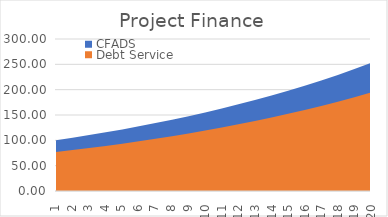
| Category | CFADS | Debt Service |
|---|---|---|
| 1.0 | 100 | 76.923 |
| 2.0 | 105.021 | 80.769 |
| 3.0 | 110.28 | 84.808 |
| 4.0 | 115.799 | 89.048 |
| 5.0 | 121.579 | 93.5 |
| 6.0 | 127.651 | 98.176 |
| 7.0 | 134.039 | 103.084 |
| 8.0 | 140.709 | 108.238 |
| 9.0 | 147.735 | 113.65 |
| 10.0 | 155.102 | 119.333 |
| 11.0 | 162.834 | 125.3 |
| 12.0 | 170.995 | 131.565 |
| 13.0 | 179.544 | 138.143 |
| 14.0 | 188.542 | 145.05 |
| 15.0 | 197.991 | 152.302 |
| 16.0 | 207.897 | 159.918 |
| 17.0 | 218.287 | 167.913 |
| 18.0 | 229.19 | 176.309 |
| 19.0 | 240.641 | 185.125 |
| 20.0 | 252.675 | 194.381 |